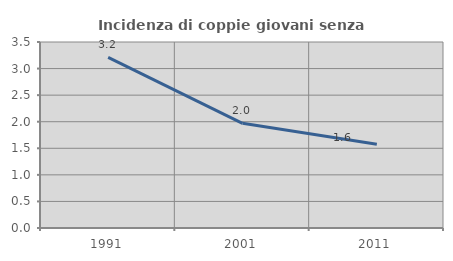
| Category | Incidenza di coppie giovani senza figli |
|---|---|
| 1991.0 | 3.211 |
| 2001.0 | 1.97 |
| 2011.0 | 1.575 |